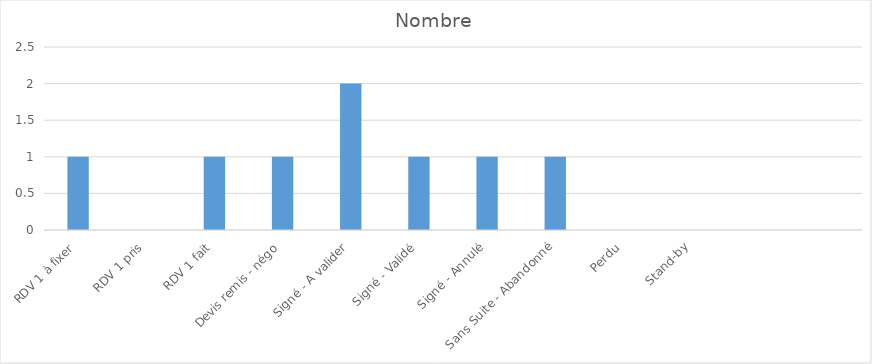
| Category | Nombre |
|---|---|
| RDV 1 à fixer | 1 |
| RDV 1 pris | 0 |
| RDV 1 fait | 1 |
| Devis remis - négo | 1 |
| Signé - A valider | 2 |
| Signé - Validé | 1 |
| Signé - Annulé | 1 |
| Sans Suite - Abandonné | 1 |
| Perdu | 0 |
| Stand-by | 0 |